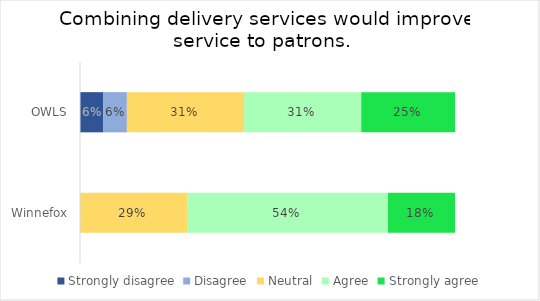
| Category | Strongly disagree | Disagree | Neutral | Agree | Strongly agree |
|---|---|---|---|---|---|
| OWLS | 0.062 | 0.062 | 0.312 | 0.312 | 0.25 |
| Winnefox | 0 | 0 | 0.286 | 0.536 | 0.179 |